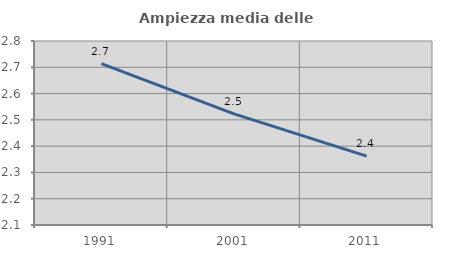
| Category | Ampiezza media delle famiglie |
|---|---|
| 1991.0 | 2.714 |
| 2001.0 | 2.523 |
| 2011.0 | 2.362 |